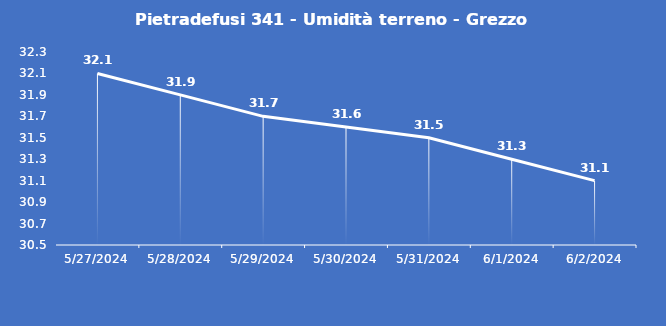
| Category | Pietradefusi 341 - Umidità terreno - Grezzo (%VWC) |
|---|---|
| 5/27/24 | 32.1 |
| 5/28/24 | 31.9 |
| 5/29/24 | 31.7 |
| 5/30/24 | 31.6 |
| 5/31/24 | 31.5 |
| 6/1/24 | 31.3 |
| 6/2/24 | 31.1 |